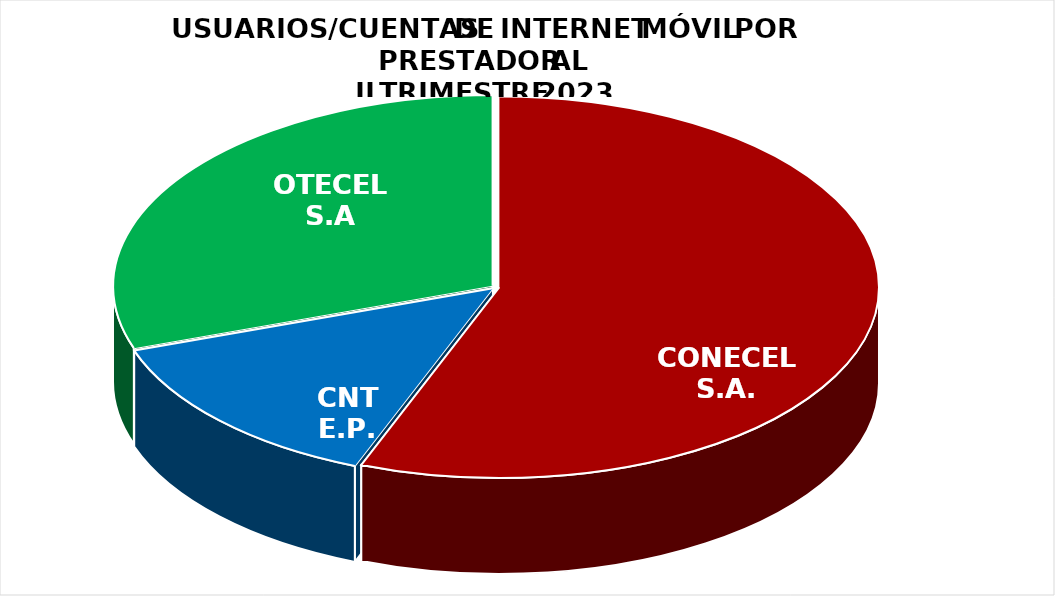
| Category | Series 0 |
|---|---|
| CONECEL S.A. | 6117259 |
| CNT E.P. | 1506531 |
| OTECEL S.A | 3314241.017 |